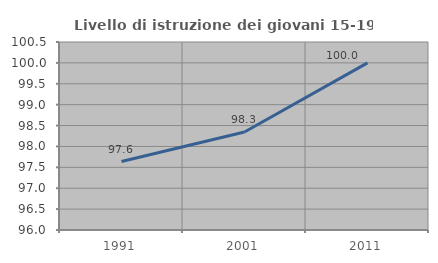
| Category | Livello di istruzione dei giovani 15-19 anni |
|---|---|
| 1991.0 | 97.638 |
| 2001.0 | 98.347 |
| 2011.0 | 100 |